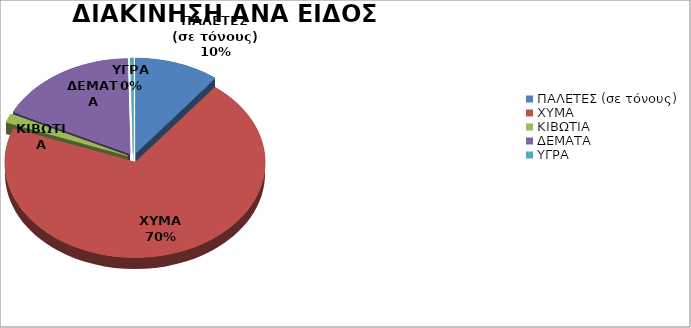
| Category | Series 0 |
|---|---|
| ΠΑΛΕΤΕΣ (σε τόνους) | 13190.35 |
| ΧΥΜΑ | 88328.38 |
| ΚΙΒΩΤΙΑ | 1901.945 |
| ΔΕΜΑΤΑ | 21910.53 |
| ΥΓΡΑ | 408.965 |